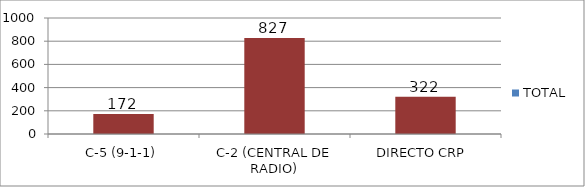
| Category | TOTAL |
|---|---|
| C-5 (9-1-1) | 172 |
| C-2 (CENTRAL DE RADIO) | 827 |
| DIRECTO CRP  | 322 |